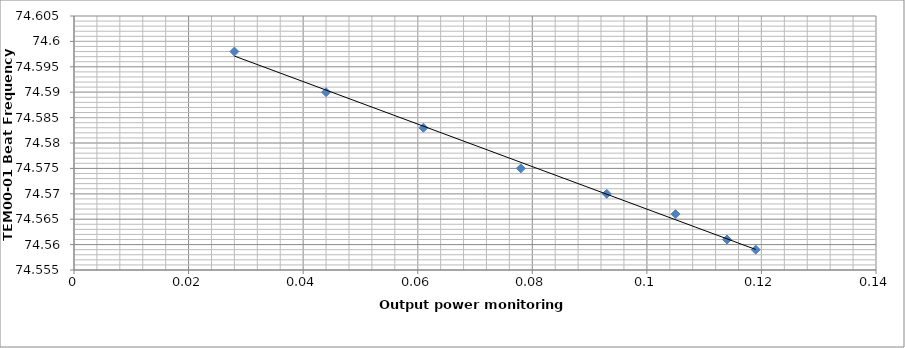
| Category | Series 0 |
|---|---|
| 0.119 | 74.559 |
| 0.114 | 74.561 |
| 0.105 | 74.566 |
| 0.093 | 74.57 |
| 0.078 | 74.575 |
| 0.061 | 74.583 |
| 0.044 | 74.59 |
| 0.028 | 74.598 |